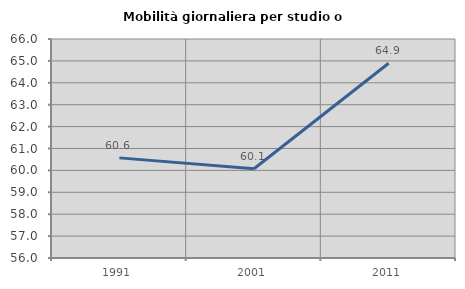
| Category | Mobilità giornaliera per studio o lavoro |
|---|---|
| 1991.0 | 60.572 |
| 2001.0 | 60.075 |
| 2011.0 | 64.893 |